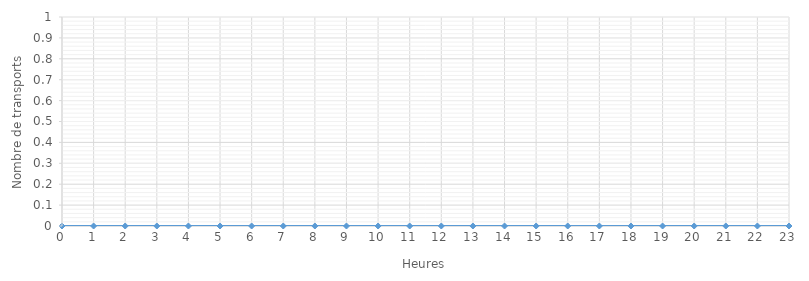
| Category | Nbr de transport |
|---|---|
| 0.0 | 0 |
| 1.0 | 0 |
| 2.0 | 0 |
| 3.0 | 0 |
| 4.0 | 0 |
| 5.0 | 0 |
| 6.0 | 0 |
| 7.0 | 0 |
| 8.0 | 0 |
| 9.0 | 0 |
| 10.0 | 0 |
| 11.0 | 0 |
| 12.0 | 0 |
| 13.0 | 0 |
| 14.0 | 0 |
| 15.0 | 0 |
| 16.0 | 0 |
| 17.0 | 0 |
| 18.0 | 0 |
| 19.0 | 0 |
| 20.0 | 0 |
| 21.0 | 0 |
| 22.0 | 0 |
| 23.0 | 0 |